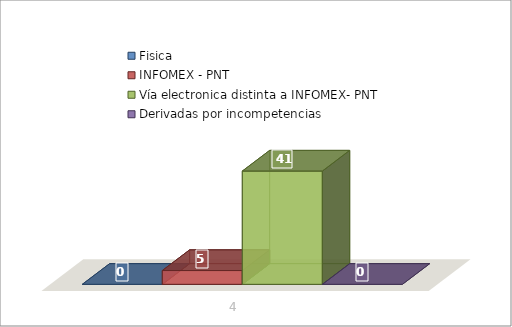
| Category | Fisica | INFOMEX - PNT | Vía electronica distinta a INFOMEX- PNT | Derivadas por incompetencias |
|---|---|---|---|---|
| 0 | 0 | 5 | 41 | 0 |